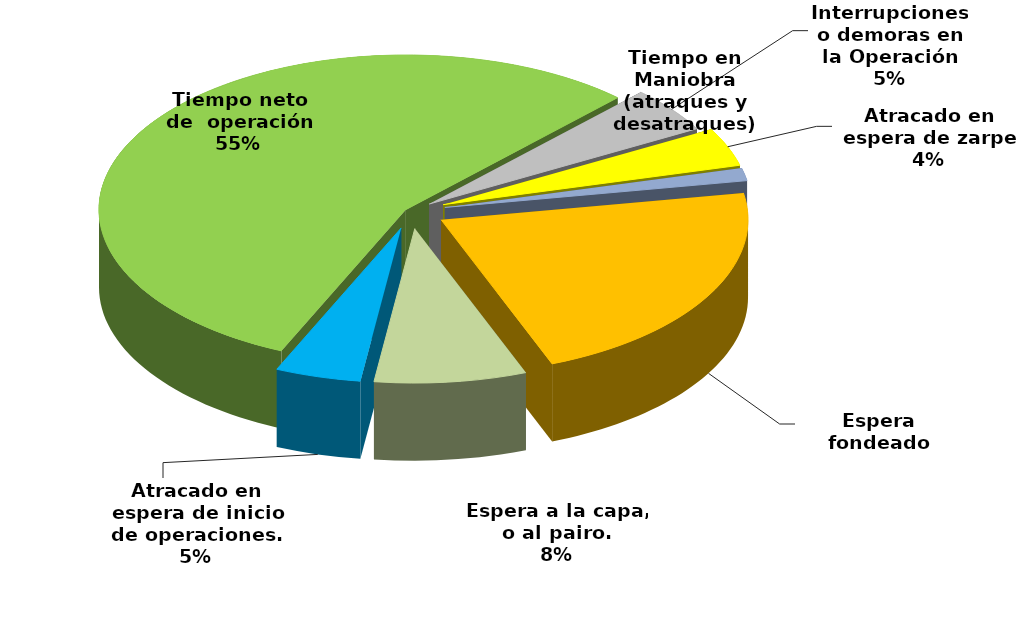
| Category | Series 0 |
|---|---|
| Espera fondeado | 37017.7 |
| Espera a la capa, o al pairo. | 13558.117 |
| Atracado en espera de inicio de operaciones. | 7638.461 |
| Tiempo neto de  operación | 93809.359 |
| Interrupciones o demoras en la Operación | 8075.52 |
| Atracado en espera de zarpe | 6780.029 |
| Tiempo en Maniobra (atraques y desatraques) | 2244.267 |